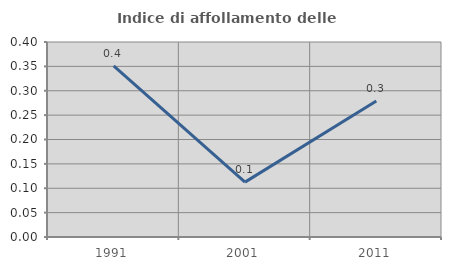
| Category | Indice di affollamento delle abitazioni  |
|---|---|
| 1991.0 | 0.351 |
| 2001.0 | 0.113 |
| 2011.0 | 0.279 |